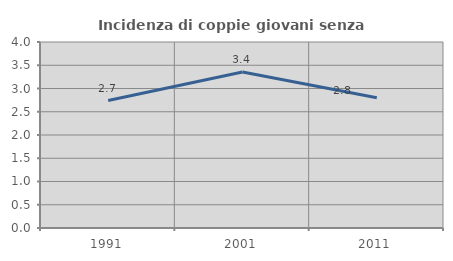
| Category | Incidenza di coppie giovani senza figli |
|---|---|
| 1991.0 | 2.741 |
| 2001.0 | 3.353 |
| 2011.0 | 2.799 |